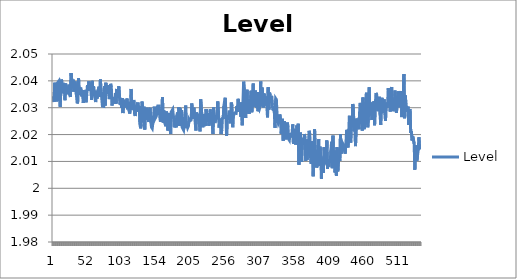
| Category | Level |
|---|---|
| 0 | 2.034 |
| 1 | 2.032 |
| 2 | 2.039 |
| 3 | 2.037 |
| 4 | 2.034 |
| 5 | 2.032 |
| 6 | 2.039 |
| 7 | 2.039 |
| 8 | 2.04 |
| 9 | 2.035 |
| 10 | 2.03 |
| 11 | 2.036 |
| 12 | 2.041 |
| 13 | 2.038 |
| 14 | 2.035 |
| 15 | 2.039 |
| 16 | 2.038 |
| 17 | 2.033 |
| 18 | 2.039 |
| 19 | 2.036 |
| 20 | 2.036 |
| 21 | 2.035 |
| 22 | 2.037 |
| 23 | 2.039 |
| 24 | 2.035 |
| 25 | 2.034 |
| 26 | 2.043 |
| 27 | 2.04 |
| 28 | 2.039 |
| 29 | 2.041 |
| 30 | 2.036 |
| 31 | 2.038 |
| 32 | 2.04 |
| 33 | 2.039 |
| 34 | 2.034 |
| 35 | 2.032 |
| 36 | 2.032 |
| 37 | 2.041 |
| 38 | 2.035 |
| 39 | 2.034 |
| 40 | 2.038 |
| 41 | 2.038 |
| 42 | 2.034 |
| 43 | 2.037 |
| 44 | 2.032 |
| 45 | 2.037 |
| 46 | 2.036 |
| 47 | 2.034 |
| 48 | 2.032 |
| 49 | 2.035 |
| 50 | 2.038 |
| 51 | 2.036 |
| 52 | 2.04 |
| 53 | 2.038 |
| 54 | 2.038 |
| 55 | 2.039 |
| 56 | 2.033 |
| 57 | 2.04 |
| 58 | 2.037 |
| 59 | 2.038 |
| 60 | 2.035 |
| 61 | 2.035 |
| 62 | 2.032 |
| 63 | 2.036 |
| 64 | 2.033 |
| 65 | 2.033 |
| 66 | 2.037 |
| 67 | 2.038 |
| 68 | 2.034 |
| 69 | 2.041 |
| 70 | 2.036 |
| 71 | 2.036 |
| 72 | 2.031 |
| 73 | 2.031 |
| 74 | 2.03 |
| 75 | 2.038 |
| 76 | 2.031 |
| 77 | 2.039 |
| 78 | 2.036 |
| 79 | 2.036 |
| 80 | 2.038 |
| 81 | 2.035 |
| 82 | 2.033 |
| 83 | 2.035 |
| 84 | 2.039 |
| 85 | 2.038 |
| 86 | 2.031 |
| 87 | 2.033 |
| 88 | 2.034 |
| 89 | 2.031 |
| 90 | 2.032 |
| 91 | 2.035 |
| 92 | 2.031 |
| 93 | 2.037 |
| 94 | 2.034 |
| 95 | 2.035 |
| 96 | 2.038 |
| 97 | 2.038 |
| 98 | 2.031 |
| 99 | 2.034 |
| 100 | 2.03 |
| 101 | 2.034 |
| 102 | 2.028 |
| 103 | 2.032 |
| 104 | 2.032 |
| 105 | 2.032 |
| 106 | 2.031 |
| 107 | 2.03 |
| 108 | 2.033 |
| 109 | 2.029 |
| 110 | 2.032 |
| 111 | 2.029 |
| 112 | 2.028 |
| 113 | 2.03 |
| 114 | 2.037 |
| 115 | 2.029 |
| 116 | 2.03 |
| 117 | 2.031 |
| 118 | 2.033 |
| 119 | 2.028 |
| 120 | 2.027 |
| 121 | 2.03 |
| 122 | 2.031 |
| 123 | 2.03 |
| 124 | 2.032 |
| 125 | 2.028 |
| 126 | 2.031 |
| 127 | 2.024 |
| 128 | 2.022 |
| 129 | 2.024 |
| 130 | 2.032 |
| 131 | 2.03 |
| 132 | 2.029 |
| 133 | 2.03 |
| 134 | 2.022 |
| 135 | 2.029 |
| 136 | 2.026 |
| 137 | 2.03 |
| 138 | 2.026 |
| 139 | 2.026 |
| 140 | 2.025 |
| 141 | 2.029 |
| 142 | 2.03 |
| 143 | 2.025 |
| 144 | 2.023 |
| 145 | 2.022 |
| 146 | 2.025 |
| 147 | 2.027 |
| 148 | 2.03 |
| 149 | 2.026 |
| 150 | 2.026 |
| 151 | 2.027 |
| 152 | 2.03 |
| 153 | 2.031 |
| 154 | 2.03 |
| 155 | 2.031 |
| 156 | 2.026 |
| 157 | 2.025 |
| 158 | 2.029 |
| 159 | 2.028 |
| 160 | 2.034 |
| 161 | 2.025 |
| 162 | 2.029 |
| 163 | 2.025 |
| 164 | 2.025 |
| 165 | 2.023 |
| 166 | 2.029 |
| 167 | 2.029 |
| 168 | 2.022 |
| 169 | 2.028 |
| 170 | 2.025 |
| 171 | 2.022 |
| 172 | 2.02 |
| 173 | 2.029 |
| 174 | 2.029 |
| 175 | 2.029 |
| 176 | 2.027 |
| 177 | 2.026 |
| 178 | 2.023 |
| 179 | 2.026 |
| 180 | 2.023 |
| 181 | 2.027 |
| 182 | 2.028 |
| 183 | 2.023 |
| 184 | 2.03 |
| 185 | 2.029 |
| 186 | 2.03 |
| 187 | 2.023 |
| 188 | 2.029 |
| 189 | 2.023 |
| 190 | 2.022 |
| 191 | 2.022 |
| 192 | 2.024 |
| 193 | 2.027 |
| 194 | 2.031 |
| 195 | 2.022 |
| 196 | 2.024 |
| 197 | 2.023 |
| 198 | 2.023 |
| 199 | 2.026 |
| 200 | 2.025 |
| 201 | 2.025 |
| 202 | 2.025 |
| 203 | 2.032 |
| 204 | 2.027 |
| 205 | 2.026 |
| 206 | 2.03 |
| 207 | 2.027 |
| 208 | 2.025 |
| 209 | 2.022 |
| 210 | 2.028 |
| 211 | 2.026 |
| 212 | 2.028 |
| 213 | 2.026 |
| 214 | 2.024 |
| 215 | 2.021 |
| 216 | 2.033 |
| 217 | 2.03 |
| 218 | 2.026 |
| 219 | 2.023 |
| 220 | 2.028 |
| 221 | 2.023 |
| 222 | 2.027 |
| 223 | 2.023 |
| 224 | 2.03 |
| 225 | 2.029 |
| 226 | 2.025 |
| 227 | 2.028 |
| 228 | 2.023 |
| 229 | 2.024 |
| 230 | 2.029 |
| 231 | 2.025 |
| 232 | 2.028 |
| 233 | 2.025 |
| 234 | 2.02 |
| 235 | 2.03 |
| 236 | 2.025 |
| 237 | 2.024 |
| 238 | 2.024 |
| 239 | 2.027 |
| 240 | 2.026 |
| 241 | 2.032 |
| 242 | 2.029 |
| 243 | 2.023 |
| 244 | 2.025 |
| 245 | 2.026 |
| 246 | 2.02 |
| 247 | 2.022 |
| 248 | 2.026 |
| 249 | 2.026 |
| 250 | 2.031 |
| 251 | 2.032 |
| 252 | 2.034 |
| 253 | 2.027 |
| 254 | 2.019 |
| 255 | 2.025 |
| 256 | 2.026 |
| 257 | 2.027 |
| 258 | 2.029 |
| 259 | 2.029 |
| 260 | 2.024 |
| 261 | 2.032 |
| 262 | 2.031 |
| 263 | 2.023 |
| 264 | 2.028 |
| 265 | 2.027 |
| 266 | 2.028 |
| 267 | 2.028 |
| 268 | 2.028 |
| 269 | 2.031 |
| 270 | 2.028 |
| 271 | 2.033 |
| 272 | 2.031 |
| 273 | 2.032 |
| 274 | 2.029 |
| 275 | 2.027 |
| 276 | 2.032 |
| 277 | 2.023 |
| 278 | 2.032 |
| 279 | 2.04 |
| 280 | 2.037 |
| 281 | 2.029 |
| 282 | 2.026 |
| 283 | 2.026 |
| 284 | 2.037 |
| 285 | 2.028 |
| 286 | 2.029 |
| 287 | 2.028 |
| 288 | 2.033 |
| 289 | 2.032 |
| 290 | 2.036 |
| 291 | 2.028 |
| 292 | 2.034 |
| 293 | 2.039 |
| 294 | 2.03 |
| 295 | 2.033 |
| 296 | 2.036 |
| 297 | 2.035 |
| 298 | 2.03 |
| 299 | 2.036 |
| 300 | 2.029 |
| 301 | 2.03 |
| 302 | 2.029 |
| 303 | 2.03 |
| 304 | 2.04 |
| 305 | 2.03 |
| 306 | 2.038 |
| 307 | 2.034 |
| 308 | 2.03 |
| 309 | 2.035 |
| 310 | 2.031 |
| 311 | 2.031 |
| 312 | 2.034 |
| 313 | 2.031 |
| 314 | 2.026 |
| 315 | 2.038 |
| 316 | 2.029 |
| 317 | 2.036 |
| 318 | 2.035 |
| 319 | 2.032 |
| 320 | 2.034 |
| 321 | 2.031 |
| 322 | 2.029 |
| 323 | 2.03 |
| 324 | 2.028 |
| 325 | 2.022 |
| 326 | 2.033 |
| 327 | 2.033 |
| 328 | 2.027 |
| 329 | 2.027 |
| 330 | 2.024 |
| 331 | 2.025 |
| 332 | 2.027 |
| 333 | 2.026 |
| 334 | 2.02 |
| 335 | 2.023 |
| 336 | 2.026 |
| 337 | 2.018 |
| 338 | 2.021 |
| 339 | 2.025 |
| 340 | 2.019 |
| 341 | 2.018 |
| 342 | 2.022 |
| 343 | 2.025 |
| 344 | 2.023 |
| 345 | 2.018 |
| 346 | 2.018 |
| 347 | 2.021 |
| 348 | 2.019 |
| 349 | 2.02 |
| 350 | 2.021 |
| 351 | 2.024 |
| 352 | 2.017 |
| 353 | 2.019 |
| 354 | 2.022 |
| 355 | 2.016 |
| 356 | 2.018 |
| 357 | 2.023 |
| 358 | 2.017 |
| 359 | 2.024 |
| 360 | 2.009 |
| 361 | 2.014 |
| 362 | 2.021 |
| 363 | 2.017 |
| 364 | 2.01 |
| 365 | 2.016 |
| 366 | 2.017 |
| 367 | 2.017 |
| 368 | 2.02 |
| 369 | 2.019 |
| 370 | 2.01 |
| 371 | 2.018 |
| 372 | 2.011 |
| 373 | 2.014 |
| 374 | 2.016 |
| 375 | 2.021 |
| 376 | 2.02 |
| 377 | 2.012 |
| 378 | 2.009 |
| 379 | 2.016 |
| 380 | 2.018 |
| 381 | 2.005 |
| 382 | 2.012 |
| 383 | 2.022 |
| 384 | 2.015 |
| 385 | 2.013 |
| 386 | 2.008 |
| 387 | 2.008 |
| 388 | 2.01 |
| 389 | 2.018 |
| 390 | 2.008 |
| 391 | 2.015 |
| 392 | 2.012 |
| 393 | 2.003 |
| 394 | 2.011 |
| 395 | 2.011 |
| 396 | 2.006 |
| 397 | 2.015 |
| 398 | 2.012 |
| 399 | 2.011 |
| 400 | 2.009 |
| 401 | 2.018 |
| 402 | 2.007 |
| 403 | 2.01 |
| 404 | 2.008 |
| 405 | 2.011 |
| 406 | 2.01 |
| 407 | 2.014 |
| 408 | 2.017 |
| 409 | 2.007 |
| 410 | 2.02 |
| 411 | 2.009 |
| 412 | 2.014 |
| 413 | 2.006 |
| 414 | 2.009 |
| 415 | 2.005 |
| 416 | 2.015 |
| 417 | 2.006 |
| 418 | 2.01 |
| 419 | 2.012 |
| 420 | 2.01 |
| 421 | 2.02 |
| 422 | 2.013 |
| 423 | 2.015 |
| 424 | 2.017 |
| 425 | 2.016 |
| 426 | 2.014 |
| 427 | 2.014 |
| 428 | 2.013 |
| 429 | 2.017 |
| 430 | 2.022 |
| 431 | 2.021 |
| 432 | 2.015 |
| 433 | 2.02 |
| 434 | 2.027 |
| 435 | 2.024 |
| 436 | 2.017 |
| 437 | 2.024 |
| 438 | 2.023 |
| 439 | 2.031 |
| 440 | 2.029 |
| 441 | 2.021 |
| 442 | 2.026 |
| 443 | 2.016 |
| 444 | 2.022 |
| 445 | 2.026 |
| 446 | 2.023 |
| 447 | 2.024 |
| 448 | 2.022 |
| 449 | 2.028 |
| 450 | 2.032 |
| 451 | 2.024 |
| 452 | 2.028 |
| 453 | 2.022 |
| 454 | 2.034 |
| 455 | 2.025 |
| 456 | 2.022 |
| 457 | 2.03 |
| 458 | 2.027 |
| 459 | 2.036 |
| 460 | 2.027 |
| 461 | 2.023 |
| 462 | 2.026 |
| 463 | 2.038 |
| 464 | 2.03 |
| 465 | 2.031 |
| 466 | 2.03 |
| 467 | 2.025 |
| 468 | 2.032 |
| 469 | 2.026 |
| 470 | 2.032 |
| 471 | 2.023 |
| 472 | 2.031 |
| 473 | 2.035 |
| 474 | 2.035 |
| 475 | 2.031 |
| 476 | 2.029 |
| 477 | 2.031 |
| 478 | 2.034 |
| 479 | 2.027 |
| 480 | 2.024 |
| 481 | 2.031 |
| 482 | 2.034 |
| 483 | 2.028 |
| 484 | 2.029 |
| 485 | 2.033 |
| 486 | 2.033 |
| 487 | 2.025 |
| 488 | 2.032 |
| 489 | 2.03 |
| 490 | 2.031 |
| 491 | 2.037 |
| 492 | 2.034 |
| 493 | 2.035 |
| 494 | 2.029 |
| 495 | 2.037 |
| 496 | 2.038 |
| 497 | 2.032 |
| 498 | 2.029 |
| 499 | 2.03 |
| 500 | 2.032 |
| 501 | 2.036 |
| 502 | 2.036 |
| 503 | 2.028 |
| 504 | 2.031 |
| 505 | 2.031 |
| 506 | 2.036 |
| 507 | 2.03 |
| 508 | 2.034 |
| 509 | 2.035 |
| 510 | 2.036 |
| 511 | 2.026 |
| 512 | 2.035 |
| 513 | 2.033 |
| 514 | 2.042 |
| 515 | 2.026 |
| 516 | 2.035 |
| 517 | 2.031 |
| 518 | 2.03 |
| 519 | 2.029 |
| 520 | 2.03 |
| 521 | 2.024 |
| 522 | 2.029 |
| 523 | 2.03 |
| 524 | 2.021 |
| 525 | 2.021 |
| 526 | 2.018 |
| 527 | 2.019 |
| 528 | 2.02 |
| 529 | 2.017 |
| 530 | 2.007 |
| 531 | 2.014 |
| 532 | 2.016 |
| 533 | 2.01 |
| 534 | 2.012 |
| 535 | 2.014 |
| 536 | 2.019 |
| 537 | 2.015 |
| 538 | 2.015 |
| 539 | 2.015 |
| 540 | 2.015 |